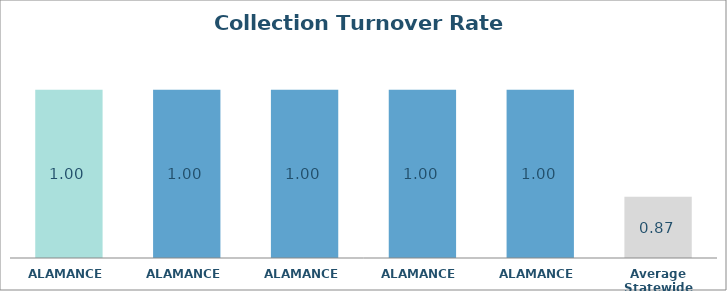
| Category | Series 0 |
|---|---|
| ALAMANCE  | 0.996 |
| ALAMANCE  | 0.996 |
| ALAMANCE  | 0.996 |
| ALAMANCE  | 0.996 |
| ALAMANCE  | 0.996 |
| Average Statewide | 0.871 |